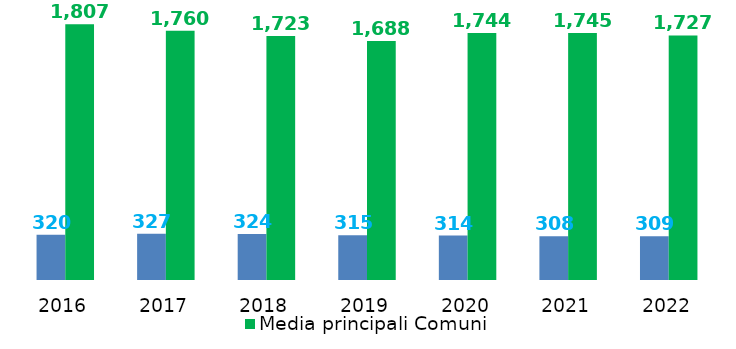
| Category | Indebitamento procapite | Media principali Comuni |
|---|---|---|
| 2016.0 | 320.01 | 1806.715 |
| 2017.0 | 326.68 | 1760.222 |
| 2018.0 | 324.06 | 1723.431 |
| 2019.0 | 315.119 | 1688.383 |
| 2020.0 | 314.18 | 1744.019 |
| 2021.0 | 308.32 | 1744.779 |
| 2022.0 | 308.88 | 1726.956 |